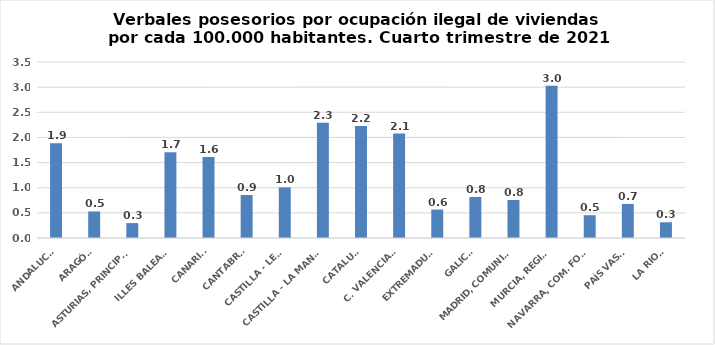
| Category | Series 0 |
|---|---|
| ANDALUCÍA | 1.886 |
| ARAGÓN | 0.528 |
| ASTURIAS, PRINCIPADO | 0.297 |
| ILLES BALEARS | 1.705 |
| CANARIAS | 1.611 |
| CANTABRIA | 0.855 |
| CASTILLA - LEÓN | 1.007 |
| CASTILLA - LA MANCHA | 2.293 |
| CATALUÑA | 2.228 |
| C. VALENCIANA | 2.076 |
| EXTREMADURA | 0.566 |
| GALICIA | 0.816 |
| MADRID, COMUNIDAD | 0.755 |
| MURCIA, REGIÓN | 3.029 |
| NAVARRA, COM. FORAL | 0.453 |
| PAÍS VASCO | 0.678 |
| LA RIOJA | 0.313 |